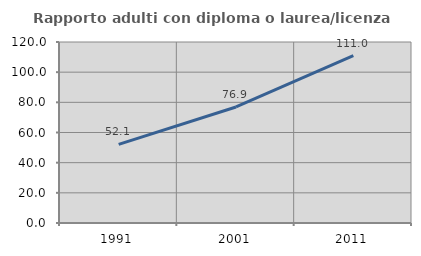
| Category | Rapporto adulti con diploma o laurea/licenza media  |
|---|---|
| 1991.0 | 52.147 |
| 2001.0 | 76.939 |
| 2011.0 | 111.013 |